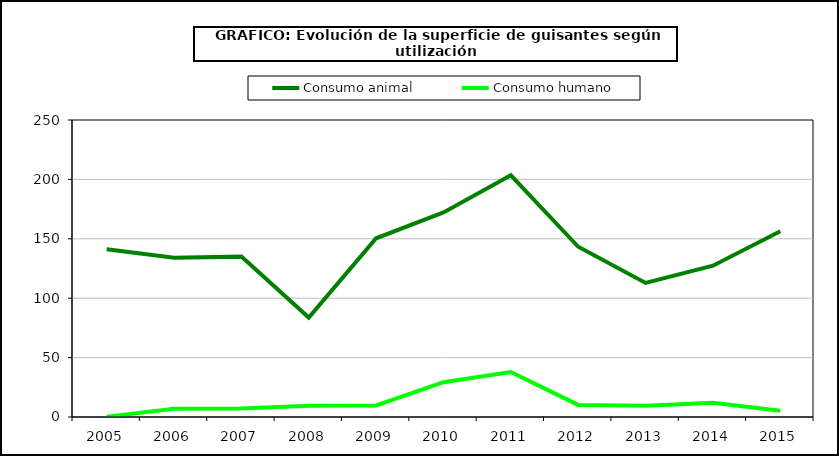
| Category | Consumo animal | Consumo humano |
|---|---|---|
| 2005.0 | 141.256 | 0.222 |
| 2006.0 | 134.078 | 7.032 |
| 2007.0 | 134.99 | 7.209 |
| 2008.0 | 83.73 | 9.431 |
| 2009.0 | 150.442 | 9.731 |
| 2010.0 | 172.145 | 29.313 |
| 2011.0 | 203.446 | 37.901 |
| 2012.0 | 143.303 | 10.179 |
| 2013.0 | 112.865 | 9.381 |
| 2014.0 | 127.342 | 12.044 |
| 2015.0 | 156.411 | 5.335 |